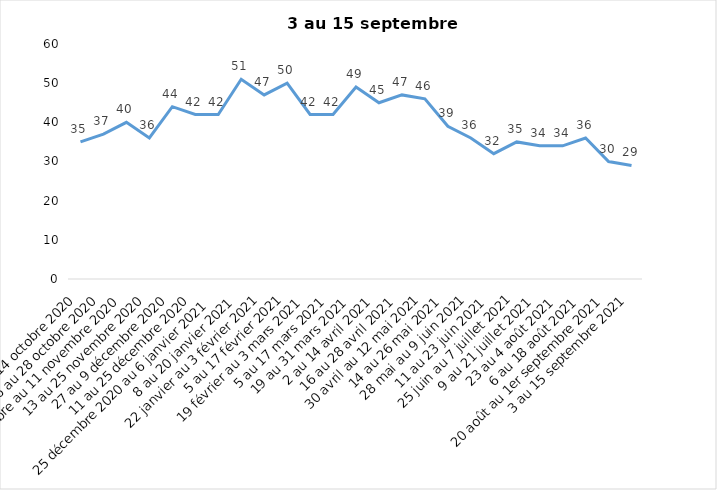
| Category | Toujours aux trois mesures |
|---|---|
| 2 au 14 octobre 2020 | 35 |
| 16 au 28 octobre 2020 | 37 |
| 30 octobre au 11 novembre 2020 | 40 |
| 13 au 25 novembre 2020 | 36 |
| 27 au 9 décembre 2020 | 44 |
| 11 au 25 décembre 2020 | 42 |
| 25 décembre 2020 au 6 janvier 2021 | 42 |
| 8 au 20 janvier 2021 | 51 |
| 22 janvier au 3 février 2021 | 47 |
| 5 au 17 février 2021 | 50 |
| 19 février au 3 mars 2021 | 42 |
| 5 au 17 mars 2021 | 42 |
| 19 au 31 mars 2021 | 49 |
| 2 au 14 avril 2021 | 45 |
| 16 au 28 avril 2021 | 47 |
| 30 avril au 12 mai 2021 | 46 |
| 14 au 26 mai 2021 | 39 |
| 28 mai au 9 juin 2021 | 36 |
| 11 au 23 juin 2021 | 32 |
| 25 juin au 7 juillet 2021 | 35 |
| 9 au 21 juillet 2021 | 34 |
| 23 au 4 août 2021 | 34 |
| 6 au 18 août 2021 | 36 |
| 20 août au 1er septembre 2021 | 30 |
| 3 au 15 septembre 2021 | 29 |